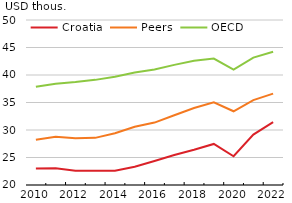
| Category | Croatia | Peers | OECD |
|---|---|---|---|
| 2010-01-01 | 23.014 | 28.21 | 37.868 |
| 2011-01-01 | 23.066 | 28.761 | 38.424 |
| 2012-01-01 | 22.602 | 28.502 | 38.722 |
| 2013-01-01 | 22.589 | 28.569 | 39.116 |
| 2014-01-01 | 22.59 | 29.396 | 39.698 |
| 2015-01-01 | 23.314 | 30.601 | 40.455 |
| 2016-01-01 | 24.349 | 31.346 | 41.009 |
| 2017-01-01 | 25.44 | 32.688 | 41.845 |
| 2018-01-01 | 26.402 | 34.002 | 42.571 |
| 2019-01-01 | 27.464 | 35.045 | 42.998 |
| 2020-01-01 | 25.231 | 33.405 | 40.974 |
| 2021-01-01 | 29.175 | 35.424 | 43.166 |
| 2022-01-01 | 31.418 | 36.606 | 44.223 |